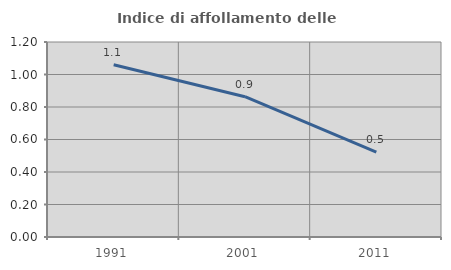
| Category | Indice di affollamento delle abitazioni  |
|---|---|
| 1991.0 | 1.06 |
| 2001.0 | 0.864 |
| 2011.0 | 0.522 |